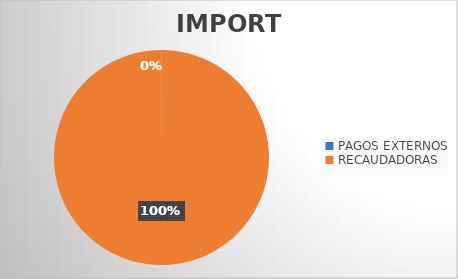
| Category | IMPORTE |
|---|---|
| PAGOS EXTERNOS | 450404.14 |
| RECAUDADORAS | 1037935069.45 |